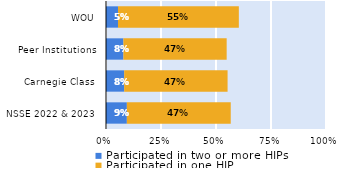
| Category | Participated in two or more HIPs | Participated in one HIP |
|---|---|---|
| NSSE 2022 & 2023 | 0.095 | 0.472 |
| Carnegie Class | 0.083 | 0.47 |
| Peer Institutions | 0.079 | 0.469 |
| WOU | 0.054 | 0.549 |